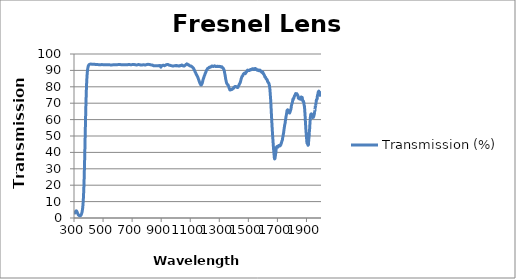
| Category | Transmission (%) |
|---|---|
| 2000.0 | 74.556 |
| 1999.0 | 74.991 |
| 1998.0 | 75.794 |
| 1997.0 | 76.391 |
| 1996.0 | 76.054 |
| 1995.0 | 74.124 |
| 1994.0 | 74.43 |
| 1993.0 | 75.409 |
| 1992.0 | 76.016 |
| 1991.0 | 76.122 |
| 1990.0 | 76.851 |
| 1989.0 | 76.344 |
| 1988.0 | 76.648 |
| 1987.0 | 76.658 |
| 1986.0 | 77.168 |
| 1985.0 | 77.383 |
| 1984.0 | 77.234 |
| 1983.0 | 76.87 |
| 1982.0 | 76.95 |
| 1981.0 | 76.724 |
| 1980.0 | 76.251 |
| 1979.0 | 75.459 |
| 1978.0 | 75.303 |
| 1977.0 | 74.959 |
| 1976.0 | 74.89 |
| 1975.0 | 74.243 |
| 1974.0 | 73.062 |
| 1973.0 | 72.383 |
| 1972.0 | 72.647 |
| 1971.0 | 72.422 |
| 1970.0 | 72.178 |
| 1969.0 | 72.176 |
| 1968.0 | 71.693 |
| 1967.0 | 70.879 |
| 1966.0 | 70.493 |
| 1965.0 | 70.109 |
| 1964.0 | 68.705 |
| 1963.0 | 68.411 |
| 1962.0 | 67.997 |
| 1961.0 | 68.36 |
| 1960.0 | 67.628 |
| 1959.0 | 66.16 |
| 1958.0 | 65.699 |
| 1957.0 | 65.7 |
| 1956.0 | 64.649 |
| 1955.0 | 63.952 |
| 1954.0 | 63.625 |
| 1953.0 | 63.057 |
| 1952.0 | 62.461 |
| 1951.0 | 62.557 |
| 1950.0 | 62.095 |
| 1949.0 | 61.901 |
| 1948.0 | 61.379 |
| 1947.0 | 61.868 |
| 1946.0 | 62.454 |
| 1945.0 | 62.087 |
| 1944.0 | 61.479 |
| 1943.0 | 61.207 |
| 1942.0 | 61.448 |
| 1941.0 | 61.783 |
| 1940.0 | 62.142 |
| 1939.0 | 62.548 |
| 1938.0 | 62.788 |
| 1937.0 | 63.078 |
| 1936.0 | 63.13 |
| 1935.0 | 63.406 |
| 1934.0 | 63.068 |
| 1933.0 | 62.27 |
| 1932.0 | 62.775 |
| 1931.0 | 63.341 |
| 1930.0 | 63.125 |
| 1929.0 | 62.636 |
| 1928.0 | 61.914 |
| 1927.0 | 61.635 |
| 1926.0 | 60.423 |
| 1925.0 | 59.042 |
| 1924.0 | 57.781 |
| 1923.0 | 56.341 |
| 1922.0 | 54.771 |
| 1921.0 | 53.07 |
| 1920.0 | 52.385 |
| 1919.0 | 51.075 |
| 1918.0 | 49.52 |
| 1917.0 | 48.86 |
| 1916.0 | 48.067 |
| 1915.0 | 46.935 |
| 1914.0 | 45.298 |
| 1913.0 | 44.588 |
| 1912.0 | 44.649 |
| 1911.0 | 44.338 |
| 1910.0 | 44.886 |
| 1909.0 | 44.728 |
| 1908.0 | 44.982 |
| 1907.0 | 45.29 |
| 1906.0 | 45.386 |
| 1905.0 | 45.528 |
| 1904.0 | 45.582 |
| 1903.0 | 46.057 |
| 1902.0 | 46.908 |
| 1901.0 | 48.236 |
| 1900.0 | 49.307 |
| 1899.0 | 50.11 |
| 1898.0 | 51.677 |
| 1897.0 | 52.567 |
| 1896.0 | 53.846 |
| 1895.0 | 55.483 |
| 1894.0 | 56.917 |
| 1893.0 | 58.222 |
| 1892.0 | 59.921 |
| 1891.0 | 61.706 |
| 1890.0 | 63.072 |
| 1889.0 | 64.466 |
| 1888.0 | 65.731 |
| 1887.0 | 67.156 |
| 1886.0 | 68.252 |
| 1885.0 | 68.36 |
| 1884.0 | 68.717 |
| 1883.0 | 69.584 |
| 1882.0 | 70.412 |
| 1881.0 | 70.571 |
| 1880.0 | 70.893 |
| 1879.0 | 71.256 |
| 1878.0 | 71.087 |
| 1877.0 | 70.913 |
| 1876.0 | 71.254 |
| 1875.0 | 71.583 |
| 1874.0 | 71.598 |
| 1873.0 | 71.85 |
| 1872.0 | 72.677 |
| 1871.0 | 73.491 |
| 1870.0 | 73.417 |
| 1869.0 | 72.924 |
| 1868.0 | 72.881 |
| 1867.0 | 73.188 |
| 1866.0 | 72.99 |
| 1865.0 | 73.398 |
| 1864.0 | 73.808 |
| 1863.0 | 73.519 |
| 1862.0 | 73.172 |
| 1861.0 | 72.753 |
| 1860.0 | 72.389 |
| 1859.0 | 72.506 |
| 1858.0 | 72.733 |
| 1857.0 | 73.066 |
| 1856.0 | 73.146 |
| 1855.0 | 72.905 |
| 1854.0 | 72.677 |
| 1853.0 | 72.751 |
| 1852.0 | 72.703 |
| 1851.0 | 72.561 |
| 1850.0 | 72.694 |
| 1849.0 | 72.956 |
| 1848.0 | 73.451 |
| 1847.0 | 73.558 |
| 1846.0 | 73.39 |
| 1845.0 | 73.051 |
| 1844.0 | 73.084 |
| 1843.0 | 73.74 |
| 1842.0 | 74.367 |
| 1841.0 | 74.657 |
| 1840.0 | 74.785 |
| 1839.0 | 74.88 |
| 1838.0 | 75.135 |
| 1837.0 | 75.31 |
| 1836.0 | 75.358 |
| 1835.0 | 75.571 |
| 1834.0 | 75.772 |
| 1833.0 | 75.747 |
| 1832.0 | 75.65 |
| 1831.0 | 75.726 |
| 1830.0 | 75.68 |
| 1829.0 | 75.749 |
| 1828.0 | 75.799 |
| 1827.0 | 75.891 |
| 1826.0 | 75.902 |
| 1825.0 | 75.77 |
| 1824.0 | 75.425 |
| 1823.0 | 75.283 |
| 1822.0 | 75.222 |
| 1821.0 | 74.855 |
| 1820.0 | 74.518 |
| 1819.0 | 74.587 |
| 1818.0 | 74.507 |
| 1817.0 | 74.283 |
| 1816.0 | 74.031 |
| 1815.0 | 73.681 |
| 1814.0 | 73.294 |
| 1813.0 | 73.019 |
| 1812.0 | 72.946 |
| 1811.0 | 72.998 |
| 1810.0 | 72.674 |
| 1809.0 | 72.191 |
| 1808.0 | 72.357 |
| 1807.0 | 72.524 |
| 1806.0 | 72.123 |
| 1805.0 | 71.607 |
| 1804.0 | 71.008 |
| 1803.0 | 70.487 |
| 1802.0 | 70.249 |
| 1801.0 | 70.07 |
| 1800.0 | 69.754 |
| 1799.0 | 69.34 |
| 1798.0 | 69.007 |
| 1797.0 | 68.733 |
| 1796.0 | 68.31 |
| 1795.0 | 67.553 |
| 1794.0 | 66.826 |
| 1793.0 | 66.417 |
| 1792.0 | 66.125 |
| 1791.0 | 65.8 |
| 1790.0 | 65.615 |
| 1789.0 | 65.395 |
| 1788.0 | 64.96 |
| 1787.0 | 64.686 |
| 1786.0 | 64.458 |
| 1785.0 | 64.192 |
| 1784.0 | 64.005 |
| 1783.0 | 64.021 |
| 1782.0 | 64.14 |
| 1781.0 | 64.364 |
| 1780.0 | 64.431 |
| 1779.0 | 64.392 |
| 1778.0 | 64.837 |
| 1777.0 | 65.115 |
| 1776.0 | 64.996 |
| 1775.0 | 65.322 |
| 1774.0 | 65.563 |
| 1773.0 | 65.633 |
| 1772.0 | 65.756 |
| 1771.0 | 65.938 |
| 1770.0 | 65.98 |
| 1769.0 | 65.838 |
| 1768.0 | 65.683 |
| 1767.0 | 65.664 |
| 1766.0 | 65.382 |
| 1765.0 | 64.76 |
| 1764.0 | 64.011 |
| 1763.0 | 63.648 |
| 1762.0 | 63.128 |
| 1761.0 | 62.469 |
| 1760.0 | 62.108 |
| 1759.0 | 61.64 |
| 1758.0 | 60.989 |
| 1757.0 | 60.375 |
| 1756.0 | 59.973 |
| 1755.0 | 59.328 |
| 1754.0 | 58.433 |
| 1753.0 | 57.873 |
| 1752.0 | 57.457 |
| 1751.0 | 57.09 |
| 1750.0 | 56.67 |
| 1749.0 | 55.966 |
| 1748.0 | 55.463 |
| 1747.0 | 54.994 |
| 1746.0 | 54.282 |
| 1745.0 | 53.715 |
| 1744.0 | 52.935 |
| 1743.0 | 52.218 |
| 1742.0 | 51.565 |
| 1741.0 | 51.225 |
| 1740.0 | 50.732 |
| 1739.0 | 50.008 |
| 1738.0 | 49.603 |
| 1737.0 | 49.312 |
| 1736.0 | 48.799 |
| 1735.0 | 48.144 |
| 1734.0 | 47.459 |
| 1733.0 | 47.33 |
| 1732.0 | 47.126 |
| 1731.0 | 46.964 |
| 1730.0 | 46.779 |
| 1729.0 | 46.237 |
| 1728.0 | 45.847 |
| 1727.0 | 45.643 |
| 1726.0 | 45.578 |
| 1725.0 | 45.236 |
| 1724.0 | 44.751 |
| 1723.0 | 44.607 |
| 1722.0 | 44.69 |
| 1721.0 | 44.641 |
| 1720.0 | 44.306 |
| 1719.0 | 44.01 |
| 1718.0 | 44.197 |
| 1717.0 | 44.018 |
| 1716.0 | 44.1 |
| 1715.0 | 44.223 |
| 1714.0 | 44.183 |
| 1713.0 | 44 |
| 1712.0 | 44 |
| 1711.0 | 44.1 |
| 1710.0 | 44.184 |
| 1709.0 | 44.156 |
| 1708.0 | 43.748 |
| 1707.0 | 43.749 |
| 1706.0 | 43.695 |
| 1705.0 | 43.391 |
| 1704.0 | 43.245 |
| 1703.0 | 43.492 |
| 1702.0 | 43.479 |
| 1701.0 | 43.516 |
| 1700.0 | 43.661 |
| 1699.0 | 43.6 |
| 1698.0 | 43.42 |
| 1697.0 | 43.306 |
| 1696.0 | 43.261 |
| 1695.0 | 43.422 |
| 1694.0 | 43.026 |
| 1693.0 | 42.841 |
| 1692.0 | 42.257 |
| 1691.0 | 41.811 |
| 1690.0 | 40.802 |
| 1689.0 | 39.723 |
| 1688.0 | 39.297 |
| 1687.0 | 38.648 |
| 1686.0 | 38.004 |
| 1685.0 | 37.336 |
| 1684.0 | 36.789 |
| 1683.0 | 36.264 |
| 1682.0 | 36.057 |
| 1681.0 | 36.155 |
| 1680.0 | 36.089 |
| 1679.0 | 36.758 |
| 1678.0 | 37.636 |
| 1677.0 | 38.804 |
| 1676.0 | 39.825 |
| 1675.0 | 40.468 |
| 1674.0 | 41.553 |
| 1673.0 | 42.733 |
| 1672.0 | 43.969 |
| 1671.0 | 45.218 |
| 1670.0 | 46.389 |
| 1669.0 | 47.788 |
| 1668.0 | 48.963 |
| 1667.0 | 50.411 |
| 1666.0 | 51.826 |
| 1665.0 | 53.201 |
| 1664.0 | 54.565 |
| 1663.0 | 56.379 |
| 1662.0 | 57.883 |
| 1661.0 | 59.445 |
| 1660.0 | 61.12 |
| 1659.0 | 62.739 |
| 1658.0 | 64.532 |
| 1657.0 | 66.438 |
| 1656.0 | 67.928 |
| 1655.0 | 69.633 |
| 1654.0 | 71.432 |
| 1653.0 | 72.838 |
| 1652.0 | 74.014 |
| 1651.0 | 75.383 |
| 1650.0 | 76.552 |
| 1649.0 | 77.812 |
| 1648.0 | 78.724 |
| 1647.0 | 79.42 |
| 1646.0 | 80.2 |
| 1645.0 | 80.862 |
| 1644.0 | 80.933 |
| 1643.0 | 81.469 |
| 1642.0 | 82.02 |
| 1641.0 | 82.03 |
| 1640.0 | 82.213 |
| 1639.0 | 82.493 |
| 1638.0 | 82.58 |
| 1637.0 | 82.571 |
| 1636.0 | 82.609 |
| 1635.0 | 82.811 |
| 1634.0 | 83.084 |
| 1633.0 | 83.395 |
| 1632.0 | 83.232 |
| 1631.0 | 83.859 |
| 1630.0 | 84.075 |
| 1629.0 | 84.194 |
| 1628.0 | 84.48 |
| 1627.0 | 84.621 |
| 1626.0 | 84.683 |
| 1625.0 | 84.506 |
| 1624.0 | 84.802 |
| 1623.0 | 84.858 |
| 1622.0 | 84.921 |
| 1621.0 | 85.175 |
| 1620.0 | 85.373 |
| 1619.0 | 85.725 |
| 1618.0 | 85.752 |
| 1617.0 | 85.79 |
| 1616.0 | 85.982 |
| 1615.0 | 85.971 |
| 1614.0 | 86.012 |
| 1613.0 | 86.125 |
| 1612.0 | 86.698 |
| 1611.0 | 86.799 |
| 1610.0 | 87.026 |
| 1609.0 | 87.222 |
| 1608.0 | 87.444 |
| 1607.0 | 87.467 |
| 1606.0 | 87.649 |
| 1605.0 | 87.858 |
| 1604.0 | 87.905 |
| 1603.0 | 87.823 |
| 1602.0 | 88.228 |
| 1601.0 | 88.705 |
| 1600.0 | 88.912 |
| 1599.0 | 88.673 |
| 1598.0 | 88.713 |
| 1597.0 | 89.034 |
| 1596.0 | 88.987 |
| 1595.0 | 88.749 |
| 1594.0 | 88.98 |
| 1593.0 | 88.854 |
| 1592.0 | 88.847 |
| 1591.0 | 89.079 |
| 1590.0 | 89.477 |
| 1589.0 | 89.428 |
| 1588.0 | 89.255 |
| 1587.0 | 89.405 |
| 1586.0 | 89.622 |
| 1585.0 | 89.693 |
| 1584.0 | 89.508 |
| 1583.0 | 89.676 |
| 1582.0 | 89.946 |
| 1581.0 | 89.848 |
| 1580.0 | 90.054 |
| 1579.0 | 90.185 |
| 1578.0 | 90.168 |
| 1577.0 | 90.065 |
| 1576.0 | 90.026 |
| 1575.0 | 90.032 |
| 1574.0 | 89.909 |
| 1573.0 | 89.815 |
| 1572.0 | 89.945 |
| 1571.0 | 89.948 |
| 1570.0 | 89.888 |
| 1569.0 | 89.972 |
| 1568.0 | 90.058 |
| 1567.0 | 90.283 |
| 1566.0 | 90.268 |
| 1565.0 | 90.165 |
| 1564.0 | 90.112 |
| 1563.0 | 90.057 |
| 1562.0 | 90.081 |
| 1561.0 | 90.141 |
| 1560.0 | 90.315 |
| 1559.0 | 90.193 |
| 1558.0 | 90.321 |
| 1557.0 | 90.558 |
| 1556.0 | 90.647 |
| 1555.0 | 90.748 |
| 1554.0 | 90.503 |
| 1553.0 | 90.548 |
| 1552.0 | 90.861 |
| 1551.0 | 90.788 |
| 1550.0 | 90.915 |
| 1549.0 | 91.116 |
| 1548.0 | 91.109 |
| 1547.0 | 91.038 |
| 1546.0 | 91.074 |
| 1545.0 | 91.094 |
| 1544.0 | 90.94 |
| 1543.0 | 90.627 |
| 1542.0 | 90.554 |
| 1541.0 | 90.858 |
| 1540.0 | 90.757 |
| 1539.0 | 90.527 |
| 1538.0 | 90.582 |
| 1537.0 | 90.649 |
| 1536.0 | 90.562 |
| 1535.0 | 90.652 |
| 1534.0 | 90.957 |
| 1533.0 | 91.032 |
| 1532.0 | 90.963 |
| 1531.0 | 90.891 |
| 1530.0 | 91.005 |
| 1529.0 | 90.965 |
| 1528.0 | 90.755 |
| 1527.0 | 90.798 |
| 1526.0 | 90.925 |
| 1525.0 | 90.84 |
| 1524.0 | 90.692 |
| 1523.0 | 90.606 |
| 1522.0 | 90.639 |
| 1521.0 | 90.463 |
| 1520.0 | 90.393 |
| 1519.0 | 90.421 |
| 1518.0 | 90.477 |
| 1517.0 | 90.536 |
| 1516.0 | 90.573 |
| 1515.0 | 90.559 |
| 1514.0 | 90.514 |
| 1513.0 | 90.376 |
| 1512.0 | 90.358 |
| 1511.0 | 90.339 |
| 1510.0 | 90.246 |
| 1509.0 | 89.991 |
| 1508.0 | 89.954 |
| 1507.0 | 90.017 |
| 1506.0 | 89.98 |
| 1505.0 | 90.046 |
| 1504.0 | 90.03 |
| 1503.0 | 89.893 |
| 1502.0 | 89.849 |
| 1501.0 | 89.908 |
| 1500.0 | 90.005 |
| 1499.0 | 90.04 |
| 1498.0 | 90.009 |
| 1497.0 | 90.045 |
| 1496.0 | 90.169 |
| 1495.0 | 90.166 |
| 1494.0 | 90.048 |
| 1493.0 | 90.044 |
| 1492.0 | 89.924 |
| 1491.0 | 89.696 |
| 1490.0 | 89.595 |
| 1489.0 | 89.404 |
| 1488.0 | 89.133 |
| 1487.0 | 88.993 |
| 1486.0 | 88.919 |
| 1485.0 | 88.927 |
| 1484.0 | 88.84 |
| 1483.0 | 88.636 |
| 1482.0 | 88.449 |
| 1481.0 | 88.32 |
| 1480.0 | 88.143 |
| 1479.0 | 88.008 |
| 1478.0 | 88.068 |
| 1477.0 | 88.161 |
| 1476.0 | 88.304 |
| 1475.0 | 88.361 |
| 1474.0 | 88.391 |
| 1473.0 | 88.377 |
| 1472.0 | 88.125 |
| 1471.0 | 87.965 |
| 1470.0 | 87.885 |
| 1469.0 | 87.832 |
| 1468.0 | 87.879 |
| 1467.0 | 87.89 |
| 1466.0 | 87.822 |
| 1465.0 | 87.631 |
| 1464.0 | 87.395 |
| 1463.0 | 87.143 |
| 1462.0 | 86.993 |
| 1461.0 | 86.765 |
| 1460.0 | 86.618 |
| 1459.0 | 86.605 |
| 1458.0 | 86.501 |
| 1457.0 | 86.415 |
| 1456.0 | 86.241 |
| 1455.0 | 85.992 |
| 1454.0 | 85.745 |
| 1453.0 | 85.475 |
| 1452.0 | 85.211 |
| 1451.0 | 84.947 |
| 1450.0 | 84.672 |
| 1449.0 | 84.312 |
| 1448.0 | 83.888 |
| 1447.0 | 83.507 |
| 1446.0 | 83.195 |
| 1445.0 | 82.972 |
| 1444.0 | 82.677 |
| 1443.0 | 82.389 |
| 1442.0 | 82.205 |
| 1441.0 | 82.082 |
| 1440.0 | 81.93 |
| 1439.0 | 81.726 |
| 1438.0 | 81.491 |
| 1437.0 | 81.315 |
| 1436.0 | 81.236 |
| 1435.0 | 81.08 |
| 1434.0 | 80.808 |
| 1433.0 | 80.608 |
| 1432.0 | 80.427 |
| 1431.0 | 80.274 |
| 1430.0 | 80.151 |
| 1429.0 | 79.926 |
| 1428.0 | 79.686 |
| 1427.0 | 79.562 |
| 1426.0 | 79.56 |
| 1425.0 | 79.577 |
| 1424.0 | 79.617 |
| 1423.0 | 79.585 |
| 1422.0 | 79.666 |
| 1421.0 | 79.865 |
| 1420.0 | 79.899 |
| 1419.0 | 79.851 |
| 1418.0 | 79.967 |
| 1417.0 | 80.079 |
| 1416.0 | 80.077 |
| 1415.0 | 80.084 |
| 1414.0 | 80.119 |
| 1413.0 | 80.159 |
| 1412.0 | 80.213 |
| 1411.0 | 80.221 |
| 1410.0 | 80.219 |
| 1409.0 | 80.165 |
| 1408.0 | 80.086 |
| 1407.0 | 80.072 |
| 1406.0 | 80.053 |
| 1405.0 | 79.88 |
| 1404.0 | 79.717 |
| 1403.0 | 79.738 |
| 1402.0 | 79.796 |
| 1401.0 | 79.72 |
| 1400.0 | 79.502 |
| 1399.0 | 79.314 |
| 1398.0 | 79.123 |
| 1397.0 | 79.014 |
| 1396.0 | 78.978 |
| 1395.0 | 79.016 |
| 1394.0 | 78.931 |
| 1393.0 | 78.878 |
| 1392.0 | 78.851 |
| 1391.0 | 78.788 |
| 1390.0 | 78.592 |
| 1389.0 | 78.45 |
| 1388.0 | 78.434 |
| 1387.0 | 78.544 |
| 1386.0 | 78.489 |
| 1385.0 | 78.473 |
| 1384.0 | 78.459 |
| 1383.0 | 78.456 |
| 1382.0 | 78.332 |
| 1381.0 | 78.287 |
| 1380.0 | 78.238 |
| 1379.0 | 78.18 |
| 1378.0 | 78.123 |
| 1377.0 | 78.21 |
| 1376.0 | 78.187 |
| 1375.0 | 78.101 |
| 1374.0 | 78.034 |
| 1373.0 | 78.148 |
| 1372.0 | 78.337 |
| 1371.0 | 78.526 |
| 1370.0 | 78.743 |
| 1369.0 | 78.975 |
| 1368.0 | 79.194 |
| 1367.0 | 79.47 |
| 1366.0 | 79.769 |
| 1365.0 | 80.144 |
| 1364.0 | 80.361 |
| 1363.0 | 80.581 |
| 1362.0 | 80.842 |
| 1361.0 | 81.035 |
| 1360.0 | 81.194 |
| 1359.0 | 81.232 |
| 1358.0 | 81.316 |
| 1357.0 | 81.379 |
| 1356.0 | 81.451 |
| 1355.0 | 81.581 |
| 1354.0 | 81.75 |
| 1353.0 | 81.878 |
| 1352.0 | 81.967 |
| 1351.0 | 82.157 |
| 1350.0 | 82.486 |
| 1349.0 | 82.791 |
| 1348.0 | 83.124 |
| 1347.0 | 83.542 |
| 1346.0 | 83.985 |
| 1345.0 | 84.432 |
| 1344.0 | 84.859 |
| 1343.0 | 85.343 |
| 1342.0 | 85.918 |
| 1341.0 | 86.447 |
| 1340.0 | 86.978 |
| 1339.0 | 87.507 |
| 1338.0 | 87.976 |
| 1337.0 | 88.393 |
| 1336.0 | 88.899 |
| 1335.0 | 89.395 |
| 1334.0 | 89.799 |
| 1333.0 | 90.099 |
| 1332.0 | 90.356 |
| 1331.0 | 90.609 |
| 1330.0 | 90.757 |
| 1329.0 | 90.908 |
| 1328.0 | 91.12 |
| 1327.0 | 91.291 |
| 1326.0 | 91.406 |
| 1325.0 | 91.563 |
| 1324.0 | 91.614 |
| 1323.0 | 91.609 |
| 1322.0 | 91.659 |
| 1321.0 | 91.747 |
| 1320.0 | 91.868 |
| 1319.0 | 92.011 |
| 1318.0 | 92.049 |
| 1317.0 | 92.203 |
| 1316.0 | 92.292 |
| 1315.0 | 92.172 |
| 1314.0 | 92.07 |
| 1313.0 | 92.08 |
| 1312.0 | 92.082 |
| 1311.0 | 92.175 |
| 1310.0 | 92.295 |
| 1309.0 | 92.338 |
| 1308.0 | 92.276 |
| 1307.0 | 92.357 |
| 1306.0 | 92.315 |
| 1305.0 | 92.329 |
| 1304.0 | 92.324 |
| 1303.0 | 92.29 |
| 1302.0 | 92.321 |
| 1301.0 | 92.391 |
| 1300.0 | 92.427 |
| 1299.0 | 92.477 |
| 1298.0 | 92.471 |
| 1297.0 | 92.4 |
| 1296.0 | 92.41 |
| 1295.0 | 92.405 |
| 1294.0 | 92.329 |
| 1293.0 | 92.369 |
| 1292.0 | 92.408 |
| 1291.0 | 92.401 |
| 1290.0 | 92.407 |
| 1289.0 | 92.534 |
| 1288.0 | 92.534 |
| 1287.0 | 92.554 |
| 1286.0 | 92.45 |
| 1285.0 | 92.428 |
| 1284.0 | 92.46 |
| 1283.0 | 92.422 |
| 1282.0 | 92.374 |
| 1281.0 | 92.322 |
| 1280.0 | 92.329 |
| 1279.0 | 92.382 |
| 1278.0 | 92.398 |
| 1277.0 | 92.466 |
| 1276.0 | 92.355 |
| 1275.0 | 92.415 |
| 1274.0 | 92.475 |
| 1273.0 | 92.598 |
| 1272.0 | 92.535 |
| 1271.0 | 92.604 |
| 1270.0 | 92.644 |
| 1269.0 | 92.747 |
| 1268.0 | 92.809 |
| 1267.0 | 92.735 |
| 1266.0 | 92.709 |
| 1265.0 | 92.673 |
| 1264.0 | 92.567 |
| 1263.0 | 92.61 |
| 1262.0 | 92.513 |
| 1261.0 | 92.429 |
| 1260.0 | 92.41 |
| 1259.0 | 92.565 |
| 1258.0 | 92.456 |
| 1257.0 | 92.451 |
| 1256.0 | 92.433 |
| 1255.0 | 92.491 |
| 1254.0 | 92.587 |
| 1253.0 | 92.513 |
| 1252.0 | 92.567 |
| 1251.0 | 92.596 |
| 1250.0 | 92.722 |
| 1249.0 | 92.714 |
| 1248.0 | 92.644 |
| 1247.0 | 92.576 |
| 1246.0 | 92.402 |
| 1245.0 | 92.444 |
| 1244.0 | 92.35 |
| 1243.0 | 92.177 |
| 1242.0 | 92.139 |
| 1241.0 | 92.083 |
| 1240.0 | 92.163 |
| 1239.0 | 92.077 |
| 1238.0 | 92.101 |
| 1237.0 | 91.931 |
| 1236.0 | 91.993 |
| 1235.0 | 91.982 |
| 1234.0 | 92.012 |
| 1233.0 | 91.949 |
| 1232.0 | 91.768 |
| 1231.0 | 91.762 |
| 1230.0 | 91.862 |
| 1229.0 | 91.755 |
| 1228.0 | 91.677 |
| 1227.0 | 91.648 |
| 1226.0 | 91.531 |
| 1225.0 | 91.436 |
| 1224.0 | 91.347 |
| 1223.0 | 91.249 |
| 1222.0 | 91.213 |
| 1221.0 | 91.126 |
| 1220.0 | 91.13 |
| 1219.0 | 91.158 |
| 1218.0 | 90.982 |
| 1217.0 | 90.771 |
| 1216.0 | 90.595 |
| 1215.0 | 90.464 |
| 1214.0 | 90.23 |
| 1213.0 | 90.145 |
| 1212.0 | 89.979 |
| 1211.0 | 89.778 |
| 1210.0 | 89.591 |
| 1209.0 | 89.345 |
| 1208.0 | 89.1 |
| 1207.0 | 88.877 |
| 1206.0 | 88.599 |
| 1205.0 | 88.466 |
| 1204.0 | 88.321 |
| 1203.0 | 88.102 |
| 1202.0 | 87.818 |
| 1201.0 | 87.559 |
| 1200.0 | 87.32 |
| 1199.0 | 87.084 |
| 1198.0 | 86.838 |
| 1197.0 | 86.661 |
| 1196.0 | 86.484 |
| 1195.0 | 86.15 |
| 1194.0 | 85.846 |
| 1193.0 | 85.605 |
| 1192.0 | 85.289 |
| 1191.0 | 84.975 |
| 1190.0 | 84.733 |
| 1189.0 | 84.525 |
| 1188.0 | 84.208 |
| 1187.0 | 83.879 |
| 1186.0 | 83.471 |
| 1185.0 | 83.213 |
| 1184.0 | 82.731 |
| 1183.0 | 82.321 |
| 1182.0 | 82.123 |
| 1181.0 | 81.935 |
| 1180.0 | 81.693 |
| 1179.0 | 81.491 |
| 1178.0 | 81.354 |
| 1177.0 | 81.268 |
| 1176.0 | 81.122 |
| 1175.0 | 81.115 |
| 1174.0 | 81.134 |
| 1173.0 | 81.164 |
| 1172.0 | 81.218 |
| 1171.0 | 81.514 |
| 1170.0 | 81.755 |
| 1169.0 | 81.851 |
| 1168.0 | 81.939 |
| 1167.0 | 82.171 |
| 1166.0 | 82.386 |
| 1165.0 | 82.627 |
| 1164.0 | 82.752 |
| 1163.0 | 83.012 |
| 1162.0 | 83.307 |
| 1161.0 | 83.519 |
| 1160.0 | 83.844 |
| 1159.0 | 84.16 |
| 1158.0 | 84.275 |
| 1157.0 | 84.499 |
| 1156.0 | 84.844 |
| 1155.0 | 85.212 |
| 1154.0 | 85.419 |
| 1153.0 | 85.567 |
| 1152.0 | 85.769 |
| 1151.0 | 86.034 |
| 1150.0 | 86.164 |
| 1149.0 | 86.306 |
| 1148.0 | 86.55 |
| 1147.0 | 86.802 |
| 1146.0 | 86.899 |
| 1145.0 | 87.117 |
| 1144.0 | 87.299 |
| 1143.0 | 87.359 |
| 1142.0 | 87.492 |
| 1141.0 | 87.695 |
| 1140.0 | 87.97 |
| 1139.0 | 88.156 |
| 1138.0 | 88.321 |
| 1137.0 | 88.557 |
| 1136.0 | 88.78 |
| 1135.0 | 88.911 |
| 1134.0 | 89.004 |
| 1133.0 | 89.2 |
| 1132.0 | 89.434 |
| 1131.0 | 89.653 |
| 1130.0 | 89.919 |
| 1129.0 | 90.114 |
| 1128.0 | 90.22 |
| 1127.0 | 90.401 |
| 1126.0 | 90.591 |
| 1125.0 | 90.78 |
| 1124.0 | 90.936 |
| 1123.0 | 91.12 |
| 1122.0 | 91.33 |
| 1121.0 | 91.501 |
| 1120.0 | 91.575 |
| 1119.0 | 91.599 |
| 1118.0 | 91.709 |
| 1117.0 | 91.832 |
| 1116.0 | 91.878 |
| 1115.0 | 92.013 |
| 1114.0 | 92.128 |
| 1113.0 | 92.164 |
| 1112.0 | 92.219 |
| 1111.0 | 92.303 |
| 1110.0 | 92.338 |
| 1109.0 | 92.358 |
| 1108.0 | 92.407 |
| 1107.0 | 92.547 |
| 1106.0 | 92.654 |
| 1105.0 | 92.578 |
| 1104.0 | 92.502 |
| 1103.0 | 92.597 |
| 1102.0 | 92.664 |
| 1101.0 | 92.602 |
| 1100.0 | 92.645 |
| 1099.0 | 92.746 |
| 1098.0 | 92.809 |
| 1097.0 | 92.831 |
| 1096.0 | 92.897 |
| 1095.0 | 92.993 |
| 1094.0 | 93.004 |
| 1093.0 | 92.992 |
| 1092.0 | 93.087 |
| 1091.0 | 93.204 |
| 1090.0 | 93.227 |
| 1089.0 | 93.21 |
| 1088.0 | 93.39 |
| 1087.0 | 93.515 |
| 1086.0 | 93.524 |
| 1085.0 | 93.533 |
| 1084.0 | 93.566 |
| 1083.0 | 93.581 |
| 1082.0 | 93.572 |
| 1081.0 | 93.701 |
| 1080.0 | 93.841 |
| 1079.0 | 93.928 |
| 1078.0 | 93.955 |
| 1077.0 | 93.971 |
| 1076.0 | 93.982 |
| 1075.0 | 93.843 |
| 1074.0 | 93.756 |
| 1073.0 | 93.743 |
| 1072.0 | 93.711 |
| 1071.0 | 93.633 |
| 1070.0 | 93.581 |
| 1069.0 | 93.477 |
| 1068.0 | 93.332 |
| 1067.0 | 93.254 |
| 1066.0 | 93.196 |
| 1065.0 | 93.131 |
| 1064.0 | 93.014 |
| 1063.0 | 92.991 |
| 1062.0 | 92.989 |
| 1061.0 | 92.888 |
| 1060.0 | 92.763 |
| 1059.0 | 92.667 |
| 1058.0 | 92.672 |
| 1057.0 | 92.666 |
| 1056.0 | 92.679 |
| 1055.0 | 92.701 |
| 1054.0 | 92.682 |
| 1053.0 | 92.69 |
| 1052.0 | 92.756 |
| 1051.0 | 92.883 |
| 1050.0 | 92.885 |
| 1049.0 | 92.848 |
| 1048.0 | 92.918 |
| 1047.0 | 93.029 |
| 1046.0 | 93.122 |
| 1045.0 | 93.134 |
| 1044.0 | 93.111 |
| 1043.0 | 93.175 |
| 1042.0 | 93.247 |
| 1041.0 | 93.266 |
| 1040.0 | 93.235 |
| 1039.0 | 93.116 |
| 1038.0 | 93.028 |
| 1037.0 | 93.011 |
| 1036.0 | 93.009 |
| 1035.0 | 92.942 |
| 1034.0 | 92.923 |
| 1033.0 | 92.96 |
| 1032.0 | 92.97 |
| 1031.0 | 93.002 |
| 1030.0 | 92.951 |
| 1029.0 | 92.816 |
| 1028.0 | 92.731 |
| 1027.0 | 92.681 |
| 1026.0 | 92.725 |
| 1025.0 | 92.748 |
| 1024.0 | 92.712 |
| 1023.0 | 92.679 |
| 1022.0 | 92.697 |
| 1021.0 | 92.762 |
| 1020.0 | 92.735 |
| 1019.0 | 92.689 |
| 1018.0 | 92.658 |
| 1017.0 | 92.694 |
| 1016.0 | 92.733 |
| 1015.0 | 92.762 |
| 1014.0 | 92.786 |
| 1013.0 | 92.829 |
| 1012.0 | 92.853 |
| 1011.0 | 92.877 |
| 1010.0 | 92.911 |
| 1009.0 | 92.857 |
| 1008.0 | 92.865 |
| 1007.0 | 92.946 |
| 1006.0 | 92.95 |
| 1005.0 | 92.896 |
| 1004.0 | 92.774 |
| 1003.0 | 92.748 |
| 1002.0 | 92.798 |
| 1001.0 | 92.965 |
| 1000.0 | 92.916 |
| 999.0 | 92.918 |
| 998.0 | 92.917 |
| 997.0 | 92.908 |
| 996.0 | 92.895 |
| 995.0 | 92.876 |
| 994.0 | 92.855 |
| 993.0 | 92.834 |
| 992.0 | 92.82 |
| 991.0 | 92.813 |
| 990.0 | 92.804 |
| 989.0 | 92.789 |
| 988.0 | 92.765 |
| 987.0 | 92.75 |
| 986.0 | 92.736 |
| 985.0 | 92.72 |
| 984.0 | 92.705 |
| 983.0 | 92.699 |
| 982.0 | 92.7 |
| 981.0 | 92.707 |
| 980.0 | 92.719 |
| 979.0 | 92.728 |
| 978.0 | 92.727 |
| 977.0 | 92.73 |
| 976.0 | 92.741 |
| 975.0 | 92.76 |
| 974.0 | 92.783 |
| 973.0 | 92.804 |
| 972.0 | 92.832 |
| 971.0 | 92.861 |
| 970.0 | 92.882 |
| 969.0 | 92.906 |
| 968.0 | 92.921 |
| 967.0 | 92.942 |
| 966.0 | 92.965 |
| 965.0 | 92.999 |
| 964.0 | 93.028 |
| 963.0 | 93.052 |
| 962.0 | 93.071 |
| 961.0 | 93.079 |
| 960.0 | 93.083 |
| 959.0 | 93.083 |
| 958.0 | 93.086 |
| 957.0 | 93.106 |
| 956.0 | 93.134 |
| 955.0 | 93.177 |
| 954.0 | 93.225 |
| 953.0 | 93.273 |
| 952.0 | 93.327 |
| 951.0 | 93.38 |
| 950.0 | 93.431 |
| 949.0 | 93.482 |
| 948.0 | 93.525 |
| 947.0 | 93.572 |
| 946.0 | 93.617 |
| 945.0 | 93.651 |
| 944.0 | 93.653 |
| 943.0 | 93.641 |
| 942.0 | 93.622 |
| 941.0 | 93.599 |
| 940.0 | 93.571 |
| 939.0 | 93.536 |
| 938.0 | 93.507 |
| 937.0 | 93.492 |
| 936.0 | 93.48 |
| 935.0 | 93.464 |
| 934.0 | 93.428 |
| 933.0 | 93.366 |
| 932.0 | 93.304 |
| 931.0 | 93.252 |
| 930.0 | 93.196 |
| 929.0 | 93.149 |
| 928.0 | 93.088 |
| 927.0 | 93.039 |
| 926.0 | 93.002 |
| 925.0 | 92.96 |
| 924.0 | 92.909 |
| 923.0 | 92.88 |
| 922.0 | 92.868 |
| 921.0 | 92.905 |
| 920.0 | 92.954 |
| 919.0 | 93.006 |
| 918.0 | 93.042 |
| 917.0 | 93.076 |
| 916.0 | 93.088 |
| 915.0 | 93.088 |
| 914.0 | 93.089 |
| 913.0 | 93.075 |
| 912.0 | 93.075 |
| 911.0 | 93.073 |
| 910.0 | 93.034 |
| 909.0 | 93.004 |
| 908.0 | 92.956 |
| 907.0 | 92.917 |
| 906.0 | 92.889 |
| 905.0 | 92.873 |
| 904.0 | 92.866 |
| 903.0 | 92.854 |
| 902.0 | 92.873 |
| 901.0 | 92.873 |
| 900.0 | 92.835 |
| 899.0 | 92.185 |
| 898.0 | 91.983 |
| 897.0 | 92.408 |
| 896.0 | 92.844 |
| 895.0 | 92.929 |
| 894.0 | 92.616 |
| 893.0 | 93.251 |
| 892.0 | 92.843 |
| 891.0 | 92.838 |
| 890.0 | 92.952 |
| 889.0 | 92.257 |
| 888.0 | 93.239 |
| 887.0 | 92.867 |
| 886.0 | 92.876 |
| 885.0 | 92.852 |
| 884.0 | 92.821 |
| 883.0 | 92.856 |
| 882.0 | 92.818 |
| 881.0 | 92.813 |
| 880.0 | 92.872 |
| 879.0 | 92.842 |
| 878.0 | 92.818 |
| 877.0 | 92.801 |
| 876.0 | 92.889 |
| 875.0 | 92.85 |
| 874.0 | 92.852 |
| 873.0 | 92.841 |
| 872.0 | 92.875 |
| 871.0 | 92.897 |
| 870.0 | 92.883 |
| 869.0 | 92.855 |
| 868.0 | 92.845 |
| 867.0 | 92.822 |
| 866.0 | 92.801 |
| 865.0 | 92.891 |
| 864.0 | 92.83 |
| 863.0 | 92.877 |
| 862.0 | 92.878 |
| 861.0 | 92.845 |
| 860.0 | 92.872 |
| 859.0 | 92.873 |
| 858.0 | 92.87 |
| 857.0 | 92.879 |
| 856.0 | 92.831 |
| 855.0 | 92.811 |
| 854.0 | 92.848 |
| 853.0 | 92.865 |
| 852.0 | 92.897 |
| 851.0 | 92.844 |
| 850.0 | 92.815 |
| 849.0 | 92.846 |
| 848.0 | 92.828 |
| 847.0 | 92.868 |
| 846.0 | 92.894 |
| 845.0 | 92.958 |
| 844.0 | 93.014 |
| 843.0 | 93.078 |
| 842.0 | 93.152 |
| 841.0 | 93.201 |
| 840.0 | 93.247 |
| 839.0 | 93.274 |
| 838.0 | 93.296 |
| 837.0 | 93.309 |
| 836.0 | 93.313 |
| 835.0 | 93.314 |
| 834.0 | 93.312 |
| 833.0 | 93.314 |
| 832.0 | 93.312 |
| 831.0 | 93.328 |
| 830.0 | 93.347 |
| 829.0 | 93.358 |
| 828.0 | 93.373 |
| 827.0 | 93.399 |
| 826.0 | 93.429 |
| 825.0 | 93.467 |
| 824.0 | 93.497 |
| 823.0 | 93.53 |
| 822.0 | 93.552 |
| 821.0 | 93.576 |
| 820.0 | 93.603 |
| 819.0 | 93.611 |
| 818.0 | 93.61 |
| 817.0 | 93.61 |
| 816.0 | 93.627 |
| 815.0 | 93.646 |
| 814.0 | 93.664 |
| 813.0 | 93.675 |
| 812.0 | 93.674 |
| 811.0 | 93.68 |
| 810.0 | 93.677 |
| 809.0 | 93.685 |
| 808.0 | 93.679 |
| 807.0 | 93.663 |
| 806.0 | 93.664 |
| 805.0 | 93.665 |
| 804.0 | 93.659 |
| 803.0 | 93.638 |
| 802.0 | 93.61 |
| 801.0 | 93.574 |
| 800.0 | 93.541 |
| 799.0 | 93.518 |
| 798.0 | 93.487 |
| 797.0 | 93.456 |
| 796.0 | 93.422 |
| 795.0 | 93.396 |
| 794.0 | 93.377 |
| 793.0 | 93.353 |
| 792.0 | 93.334 |
| 791.0 | 93.321 |
| 790.0 | 93.313 |
| 789.0 | 93.312 |
| 788.0 | 93.319 |
| 787.0 | 93.333 |
| 786.0 | 93.34 |
| 785.0 | 93.351 |
| 784.0 | 93.367 |
| 783.0 | 93.385 |
| 782.0 | 93.401 |
| 781.0 | 93.414 |
| 780.0 | 93.428 |
| 779.0 | 93.436 |
| 778.0 | 93.435 |
| 777.0 | 93.432 |
| 776.0 | 93.429 |
| 775.0 | 93.419 |
| 774.0 | 93.401 |
| 773.0 | 93.385 |
| 772.0 | 93.372 |
| 771.0 | 93.356 |
| 770.0 | 93.342 |
| 769.0 | 93.326 |
| 768.0 | 93.312 |
| 767.0 | 93.293 |
| 766.0 | 93.28 |
| 765.0 | 93.278 |
| 764.0 | 93.278 |
| 763.0 | 93.275 |
| 762.0 | 93.28 |
| 761.0 | 93.289 |
| 760.0 | 93.3 |
| 759.0 | 93.31 |
| 758.0 | 93.321 |
| 757.0 | 93.334 |
| 756.0 | 93.354 |
| 755.0 | 93.377 |
| 754.0 | 93.407 |
| 753.0 | 93.438 |
| 752.0 | 93.46 |
| 751.0 | 93.482 |
| 750.0 | 93.506 |
| 749.0 | 93.521 |
| 748.0 | 93.531 |
| 747.0 | 93.541 |
| 746.0 | 93.544 |
| 745.0 | 93.549 |
| 744.0 | 93.55 |
| 743.0 | 93.542 |
| 742.0 | 93.528 |
| 741.0 | 93.51 |
| 740.0 | 93.486 |
| 739.0 | 93.463 |
| 738.0 | 93.442 |
| 737.0 | 93.42 |
| 736.0 | 93.403 |
| 735.0 | 93.388 |
| 734.0 | 93.371 |
| 733.0 | 93.355 |
| 732.0 | 93.339 |
| 731.0 | 93.328 |
| 730.0 | 93.324 |
| 729.0 | 93.33 |
| 728.0 | 93.337 |
| 727.0 | 93.351 |
| 726.0 | 93.368 |
| 725.0 | 93.38 |
| 724.0 | 93.391 |
| 723.0 | 93.404 |
| 722.0 | 93.423 |
| 721.0 | 93.446 |
| 720.0 | 93.473 |
| 719.0 | 93.498 |
| 718.0 | 93.516 |
| 717.0 | 93.528 |
| 716.0 | 93.534 |
| 715.0 | 93.54 |
| 714.0 | 93.542 |
| 713.0 | 93.545 |
| 712.0 | 93.552 |
| 711.0 | 93.559 |
| 710.0 | 93.563 |
| 709.0 | 93.561 |
| 708.0 | 93.557 |
| 707.0 | 93.551 |
| 706.0 | 93.545 |
| 705.0 | 93.54 |
| 704.0 | 93.537 |
| 703.0 | 93.536 |
| 702.0 | 93.535 |
| 701.0 | 93.533 |
| 700.0 | 93.527 |
| 699.0 | 93.517 |
| 698.0 | 93.505 |
| 697.0 | 93.492 |
| 696.0 | 93.478 |
| 695.0 | 93.467 |
| 694.0 | 93.458 |
| 693.0 | 93.456 |
| 692.0 | 93.456 |
| 691.0 | 93.458 |
| 690.0 | 93.458 |
| 689.0 | 93.457 |
| 688.0 | 93.462 |
| 687.0 | 93.473 |
| 686.0 | 93.492 |
| 685.0 | 93.512 |
| 684.0 | 93.533 |
| 683.0 | 93.557 |
| 682.0 | 93.578 |
| 681.0 | 93.593 |
| 680.0 | 93.6 |
| 679.0 | 93.602 |
| 678.0 | 93.6 |
| 677.0 | 93.594 |
| 676.0 | 93.589 |
| 675.0 | 93.577 |
| 674.0 | 93.562 |
| 673.0 | 93.542 |
| 672.0 | 93.52 |
| 671.0 | 93.499 |
| 670.0 | 93.476 |
| 669.0 | 93.453 |
| 668.0 | 93.435 |
| 667.0 | 93.422 |
| 666.0 | 93.413 |
| 665.0 | 93.409 |
| 664.0 | 93.409 |
| 663.0 | 93.41 |
| 662.0 | 93.413 |
| 661.0 | 93.412 |
| 660.0 | 93.41 |
| 659.0 | 93.408 |
| 658.0 | 93.408 |
| 657.0 | 93.41 |
| 656.0 | 93.413 |
| 655.0 | 93.413 |
| 654.0 | 93.41 |
| 653.0 | 93.404 |
| 652.0 | 93.396 |
| 651.0 | 93.39 |
| 650.0 | 93.384 |
| 649.0 | 93.38 |
| 648.0 | 93.38 |
| 647.0 | 93.384 |
| 646.0 | 93.39 |
| 645.0 | 93.398 |
| 644.0 | 93.402 |
| 643.0 | 93.406 |
| 642.0 | 93.411 |
| 641.0 | 93.42 |
| 640.0 | 93.432 |
| 639.0 | 93.445 |
| 638.0 | 93.454 |
| 637.0 | 93.457 |
| 636.0 | 93.459 |
| 635.0 | 93.463 |
| 634.0 | 93.465 |
| 633.0 | 93.464 |
| 632.0 | 93.463 |
| 631.0 | 93.467 |
| 630.0 | 93.473 |
| 629.0 | 93.477 |
| 628.0 | 93.48 |
| 627.0 | 93.48 |
| 626.0 | 93.479 |
| 625.0 | 93.483 |
| 624.0 | 93.493 |
| 623.0 | 93.504 |
| 622.0 | 93.511 |
| 621.0 | 93.518 |
| 620.0 | 93.527 |
| 619.0 | 93.534 |
| 618.0 | 93.538 |
| 617.0 | 93.54 |
| 616.0 | 93.543 |
| 615.0 | 93.544 |
| 614.0 | 93.549 |
| 613.0 | 93.553 |
| 612.0 | 93.556 |
| 611.0 | 93.555 |
| 610.0 | 93.554 |
| 609.0 | 93.557 |
| 608.0 | 93.557 |
| 607.0 | 93.552 |
| 606.0 | 93.547 |
| 605.0 | 93.544 |
| 604.0 | 93.539 |
| 603.0 | 93.534 |
| 602.0 | 93.528 |
| 601.0 | 93.518 |
| 600.0 | 93.511 |
| 599.0 | 93.501 |
| 598.0 | 93.494 |
| 597.0 | 93.487 |
| 596.0 | 93.478 |
| 595.0 | 93.472 |
| 594.0 | 93.468 |
| 593.0 | 93.466 |
| 592.0 | 93.464 |
| 591.0 | 93.462 |
| 590.0 | 93.46 |
| 589.0 | 93.46 |
| 588.0 | 93.462 |
| 587.0 | 93.461 |
| 586.0 | 93.462 |
| 585.0 | 93.461 |
| 584.0 | 93.458 |
| 583.0 | 93.456 |
| 582.0 | 93.45 |
| 581.0 | 93.446 |
| 580.0 | 93.441 |
| 579.0 | 93.438 |
| 578.0 | 93.437 |
| 577.0 | 93.436 |
| 576.0 | 93.433 |
| 575.0 | 93.431 |
| 574.0 | 93.43 |
| 573.0 | 93.426 |
| 572.0 | 93.42 |
| 571.0 | 93.414 |
| 570.0 | 93.409 |
| 569.0 | 93.404 |
| 568.0 | 93.399 |
| 567.0 | 93.39 |
| 566.0 | 93.381 |
| 565.0 | 93.368 |
| 564.0 | 93.356 |
| 563.0 | 93.343 |
| 562.0 | 93.332 |
| 561.0 | 93.322 |
| 560.0 | 93.312 |
| 559.0 | 93.309 |
| 558.0 | 93.309 |
| 557.0 | 93.309 |
| 556.0 | 93.311 |
| 555.0 | 93.311 |
| 554.0 | 93.315 |
| 553.0 | 93.319 |
| 552.0 | 93.327 |
| 551.0 | 93.338 |
| 550.0 | 93.35 |
| 549.0 | 93.357 |
| 548.0 | 93.366 |
| 547.0 | 93.378 |
| 546.0 | 93.388 |
| 545.0 | 93.396 |
| 544.0 | 93.402 |
| 543.0 | 93.409 |
| 542.0 | 93.418 |
| 541.0 | 93.43 |
| 540.0 | 93.441 |
| 539.0 | 93.45 |
| 538.0 | 93.454 |
| 537.0 | 93.459 |
| 536.0 | 93.47 |
| 535.0 | 93.478 |
| 534.0 | 93.484 |
| 533.0 | 93.489 |
| 532.0 | 93.492 |
| 531.0 | 93.496 |
| 530.0 | 93.5 |
| 529.0 | 93.506 |
| 528.0 | 93.503 |
| 527.0 | 93.5 |
| 526.0 | 93.498 |
| 525.0 | 93.498 |
| 524.0 | 93.495 |
| 523.0 | 93.489 |
| 522.0 | 93.482 |
| 521.0 | 93.474 |
| 520.0 | 93.466 |
| 519.0 | 93.459 |
| 518.0 | 93.452 |
| 517.0 | 93.439 |
| 516.0 | 93.426 |
| 515.0 | 93.418 |
| 514.0 | 93.407 |
| 513.0 | 93.394 |
| 512.0 | 93.386 |
| 511.0 | 93.382 |
| 510.0 | 93.38 |
| 509.0 | 93.381 |
| 508.0 | 93.384 |
| 507.0 | 93.386 |
| 506.0 | 93.389 |
| 505.0 | 93.396 |
| 504.0 | 93.409 |
| 503.0 | 93.422 |
| 502.0 | 93.439 |
| 501.0 | 93.458 |
| 500.0 | 93.478 |
| 499.0 | 93.494 |
| 498.0 | 93.505 |
| 497.0 | 93.514 |
| 496.0 | 93.52 |
| 495.0 | 93.525 |
| 494.0 | 93.533 |
| 493.0 | 93.54 |
| 492.0 | 93.54 |
| 491.0 | 93.535 |
| 490.0 | 93.533 |
| 489.0 | 93.522 |
| 488.0 | 93.51 |
| 487.0 | 93.5 |
| 486.0 | 93.49 |
| 485.0 | 93.482 |
| 484.0 | 93.477 |
| 483.0 | 93.475 |
| 482.0 | 93.47 |
| 481.0 | 93.465 |
| 480.0 | 93.46 |
| 479.0 | 93.461 |
| 478.0 | 93.461 |
| 477.0 | 93.46 |
| 476.0 | 93.464 |
| 475.0 | 93.468 |
| 474.0 | 93.473 |
| 473.0 | 93.478 |
| 472.0 | 93.487 |
| 471.0 | 93.494 |
| 470.0 | 93.498 |
| 469.0 | 93.505 |
| 468.0 | 93.512 |
| 467.0 | 93.52 |
| 466.0 | 93.526 |
| 465.0 | 93.53 |
| 464.0 | 93.534 |
| 463.0 | 93.54 |
| 462.0 | 93.543 |
| 461.0 | 93.542 |
| 460.0 | 93.542 |
| 459.0 | 93.542 |
| 458.0 | 93.541 |
| 457.0 | 93.541 |
| 456.0 | 93.54 |
| 455.0 | 93.542 |
| 454.0 | 93.54 |
| 453.0 | 93.543 |
| 452.0 | 93.554 |
| 451.0 | 93.568 |
| 450.0 | 93.578 |
| 449.0 | 93.595 |
| 448.0 | 93.615 |
| 447.0 | 93.631 |
| 446.0 | 93.644 |
| 445.0 | 93.663 |
| 444.0 | 93.68 |
| 443.0 | 93.696 |
| 442.0 | 93.71 |
| 441.0 | 93.73 |
| 440.0 | 93.746 |
| 439.0 | 93.752 |
| 438.0 | 93.759 |
| 437.0 | 93.764 |
| 436.0 | 93.769 |
| 435.0 | 93.771 |
| 434.0 | 93.779 |
| 433.0 | 93.783 |
| 432.0 | 93.78 |
| 431.0 | 93.782 |
| 430.0 | 93.785 |
| 429.0 | 93.79 |
| 428.0 | 93.788 |
| 427.0 | 93.786 |
| 426.0 | 93.794 |
| 425.0 | 93.8 |
| 424.0 | 93.806 |
| 423.0 | 93.807 |
| 422.0 | 93.812 |
| 421.0 | 93.813 |
| 420.0 | 93.819 |
| 419.0 | 93.829 |
| 418.0 | 93.833 |
| 417.0 | 93.833 |
| 416.0 | 93.834 |
| 415.0 | 93.84 |
| 414.0 | 93.836 |
| 413.0 | 93.823 |
| 412.0 | 93.806 |
| 411.0 | 93.791 |
| 410.0 | 93.775 |
| 409.0 | 93.745 |
| 408.0 | 93.706 |
| 407.0 | 93.651 |
| 406.0 | 93.584 |
| 405.0 | 93.58 |
| 404.0 | 93.532 |
| 403.0 | 93.421 |
| 402.0 | 93.269 |
| 401.0 | 93.092 |
| 400.0 | 92.927 |
| 399.0 | 92.73 |
| 398.0 | 92.522 |
| 397.0 | 92.224 |
| 396.0 | 91.808 |
| 395.0 | 91.341 |
| 394.0 | 90.772 |
| 393.0 | 90.076 |
| 392.0 | 89.189 |
| 391.0 | 88.133 |
| 390.0 | 86.973 |
| 389.0 | 85.655 |
| 388.0 | 84.111 |
| 387.0 | 82.265 |
| 386.0 | 80.168 |
| 385.0 | 77.753 |
| 384.0 | 75.083 |
| 383.0 | 72.205 |
| 382.0 | 69.019 |
| 381.0 | 65.621 |
| 380.0 | 61.984 |
| 379.0 | 58.197 |
| 378.0 | 54.349 |
| 377.0 | 50.381 |
| 376.0 | 46.359 |
| 375.0 | 42.339 |
| 374.0 | 38.426 |
| 373.0 | 34.623 |
| 372.0 | 31.009 |
| 371.0 | 27.608 |
| 370.0 | 24.437 |
| 369.0 | 21.544 |
| 368.0 | 18.902 |
| 367.0 | 16.575 |
| 366.0 | 14.468 |
| 365.0 | 12.59 |
| 364.0 | 10.95 |
| 363.0 | 9.525 |
| 362.0 | 8.325 |
| 361.0 | 7.275 |
| 360.0 | 6.384 |
| 359.0 | 5.608 |
| 358.0 | 4.949 |
| 357.0 | 4.382 |
| 356.0 | 3.89 |
| 355.0 | 3.472 |
| 354.0 | 3.105 |
| 353.0 | 2.794 |
| 352.0 | 2.518 |
| 351.0 | 2.284 |
| 350.0 | 2.082 |
| 349.0 | 1.9 |
| 348.0 | 1.752 |
| 347.0 | 1.623 |
| 346.0 | 1.533 |
| 345.0 | 1.474 |
| 344.0 | 1.422 |
| 343.0 | 1.374 |
| 342.0 | 1.335 |
| 341.0 | 1.318 |
| 340.0 | 1.326 |
| 339.0 | 1.35 |
| 338.0 | 1.368 |
| 337.0 | 1.396 |
| 336.0 | 1.444 |
| 335.0 | 1.499 |
| 334.0 | 1.572 |
| 333.0 | 1.644 |
| 332.0 | 1.721 |
| 331.0 | 1.826 |
| 330.0 | 1.961 |
| 329.0 | 2.122 |
| 328.0 | 2.273 |
| 327.0 | 2.434 |
| 326.0 | 2.629 |
| 325.0 | 2.84 |
| 324.0 | 3.055 |
| 323.0 | 3.262 |
| 322.0 | 3.47 |
| 321.0 | 3.679 |
| 320.0 | 3.863 |
| 319.0 | 4.023 |
| 318.0 | 4.175 |
| 317.0 | 4.294 |
| 316.0 | 4.344 |
| 315.0 | 4.352 |
| 314.0 | 4.307 |
| 313.0 | 4.217 |
| 312.0 | 4.122 |
| 311.0 | 4.004 |
| 310.0 | 3.869 |
| 309.0 | 3.727 |
| 308.0 | 3.554 |
| 307.0 | 3.385 |
| 306.0 | 3.226 |
| 305.0 | 3.101 |
| 304.0 | 2.971 |
| 303.0 | 2.866 |
| 302.0 | 2.797 |
| 301.0 | 2.747 |
| 300.0 | 2.694 |